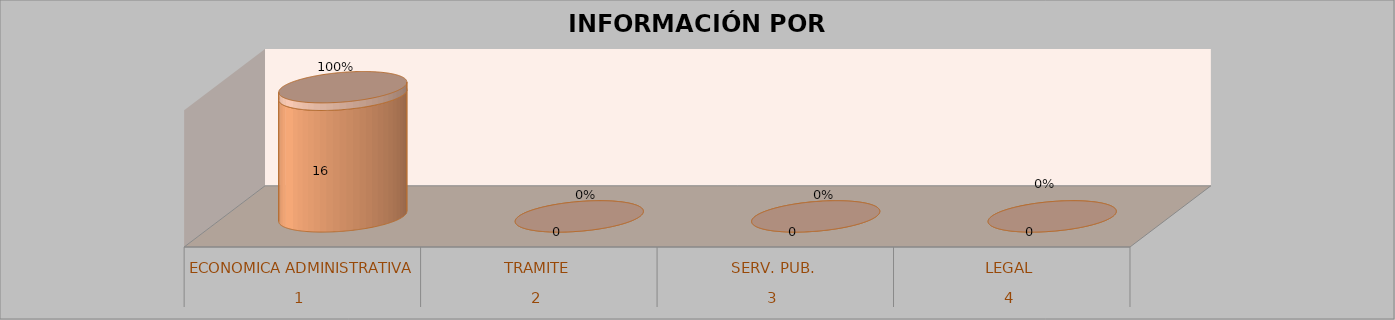
| Category | Series 0 | Series 1 | Series 2 | Series 3 |
|---|---|---|---|---|
| 0 |  |  | 16 | 1 |
| 1 |  |  | 0 | 0 |
| 2 |  |  | 0 | 0 |
| 3 |  |  | 0 | 0 |